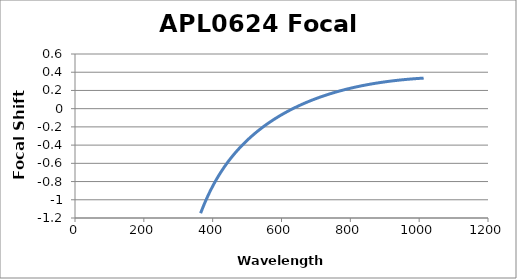
| Category | Focal Shift (mm) |
|---|---|
| 365.0 | -1.148 |
| 366.0 | -1.138 |
| 367.0 | -1.128 |
| 368.0 | -1.118 |
| 369.0 | -1.109 |
| 370.0 | -1.099 |
| 371.0 | -1.09 |
| 372.0 | -1.08 |
| 373.0 | -1.071 |
| 374.0 | -1.062 |
| 375.0 | -1.053 |
| 376.0 | -1.044 |
| 377.0 | -1.035 |
| 378.0 | -1.026 |
| 379.0 | -1.017 |
| 380.0 | -1.009 |
| 381.0 | -1 |
| 382.0 | -0.992 |
| 383.0 | -0.983 |
| 384.0 | -0.975 |
| 385.0 | -0.967 |
| 386.0 | -0.958 |
| 387.0 | -0.95 |
| 388.0 | -0.942 |
| 389.0 | -0.934 |
| 390.0 | -0.926 |
| 391.0 | -0.919 |
| 392.0 | -0.911 |
| 393.0 | -0.903 |
| 394.0 | -0.896 |
| 395.0 | -0.888 |
| 396.0 | -0.881 |
| 397.0 | -0.873 |
| 398.0 | -0.866 |
| 399.0 | -0.859 |
| 400.0 | -0.852 |
| 401.0 | -0.844 |
| 402.0 | -0.837 |
| 403.0 | -0.83 |
| 404.0 | -0.823 |
| 405.0 | -0.816 |
| 406.0 | -0.81 |
| 407.0 | -0.803 |
| 408.0 | -0.796 |
| 409.0 | -0.79 |
| 410.0 | -0.783 |
| 411.0 | -0.776 |
| 412.0 | -0.77 |
| 413.0 | -0.763 |
| 414.0 | -0.757 |
| 415.0 | -0.751 |
| 416.0 | -0.744 |
| 417.0 | -0.738 |
| 418.0 | -0.732 |
| 419.0 | -0.726 |
| 420.0 | -0.72 |
| 421.0 | -0.714 |
| 422.0 | -0.708 |
| 423.0 | -0.702 |
| 424.0 | -0.696 |
| 425.0 | -0.69 |
| 426.0 | -0.684 |
| 427.0 | -0.678 |
| 428.0 | -0.673 |
| 429.0 | -0.667 |
| 430.0 | -0.661 |
| 431.0 | -0.656 |
| 432.0 | -0.65 |
| 433.0 | -0.645 |
| 434.0 | -0.639 |
| 435.0 | -0.634 |
| 436.0 | -0.628 |
| 437.0 | -0.623 |
| 438.0 | -0.618 |
| 439.0 | -0.613 |
| 440.0 | -0.607 |
| 441.0 | -0.602 |
| 442.0 | -0.597 |
| 443.0 | -0.592 |
| 444.0 | -0.587 |
| 445.0 | -0.582 |
| 446.0 | -0.577 |
| 447.0 | -0.572 |
| 448.0 | -0.567 |
| 449.0 | -0.562 |
| 450.0 | -0.557 |
| 451.0 | -0.552 |
| 452.0 | -0.547 |
| 453.0 | -0.542 |
| 454.0 | -0.538 |
| 455.0 | -0.533 |
| 456.0 | -0.528 |
| 457.0 | -0.524 |
| 458.0 | -0.519 |
| 459.0 | -0.514 |
| 460.0 | -0.51 |
| 461.0 | -0.505 |
| 462.0 | -0.501 |
| 463.0 | -0.496 |
| 464.0 | -0.492 |
| 465.0 | -0.487 |
| 466.0 | -0.483 |
| 467.0 | -0.479 |
| 468.0 | -0.474 |
| 469.0 | -0.47 |
| 470.0 | -0.466 |
| 471.0 | -0.461 |
| 472.0 | -0.457 |
| 473.0 | -0.453 |
| 474.0 | -0.449 |
| 475.0 | -0.445 |
| 476.0 | -0.441 |
| 477.0 | -0.436 |
| 478.0 | -0.432 |
| 479.0 | -0.428 |
| 480.0 | -0.424 |
| 481.0 | -0.42 |
| 482.0 | -0.416 |
| 483.0 | -0.412 |
| 484.0 | -0.408 |
| 485.0 | -0.405 |
| 486.0 | -0.401 |
| 487.0 | -0.397 |
| 488.0 | -0.393 |
| 489.0 | -0.389 |
| 490.0 | -0.385 |
| 491.0 | -0.381 |
| 492.0 | -0.378 |
| 493.0 | -0.374 |
| 494.0 | -0.37 |
| 495.0 | -0.367 |
| 496.0 | -0.363 |
| 497.0 | -0.359 |
| 498.0 | -0.356 |
| 499.0 | -0.352 |
| 500.0 | -0.348 |
| 501.0 | -0.345 |
| 502.0 | -0.341 |
| 503.0 | -0.338 |
| 504.0 | -0.334 |
| 505.0 | -0.331 |
| 506.0 | -0.327 |
| 507.0 | -0.324 |
| 508.0 | -0.32 |
| 509.0 | -0.317 |
| 510.0 | -0.314 |
| 511.0 | -0.31 |
| 512.0 | -0.307 |
| 513.0 | -0.303 |
| 514.0 | -0.3 |
| 515.0 | -0.297 |
| 516.0 | -0.294 |
| 517.0 | -0.29 |
| 518.0 | -0.287 |
| 519.0 | -0.284 |
| 520.0 | -0.28 |
| 521.0 | -0.277 |
| 522.0 | -0.274 |
| 523.0 | -0.271 |
| 524.0 | -0.268 |
| 525.0 | -0.265 |
| 526.0 | -0.261 |
| 527.0 | -0.258 |
| 528.0 | -0.255 |
| 529.0 | -0.252 |
| 530.0 | -0.249 |
| 531.0 | -0.246 |
| 532.0 | -0.243 |
| 533.0 | -0.24 |
| 534.0 | -0.237 |
| 535.0 | -0.234 |
| 536.0 | -0.231 |
| 537.0 | -0.228 |
| 538.0 | -0.225 |
| 539.0 | -0.222 |
| 540.0 | -0.219 |
| 541.0 | -0.216 |
| 542.0 | -0.213 |
| 543.0 | -0.211 |
| 544.0 | -0.208 |
| 545.0 | -0.205 |
| 546.0 | -0.202 |
| 547.0 | -0.199 |
| 548.0 | -0.196 |
| 549.0 | -0.194 |
| 550.0 | -0.191 |
| 551.0 | -0.188 |
| 552.0 | -0.185 |
| 553.0 | -0.183 |
| 554.0 | -0.18 |
| 555.0 | -0.177 |
| 556.0 | -0.175 |
| 557.0 | -0.172 |
| 558.0 | -0.169 |
| 559.0 | -0.166 |
| 560.0 | -0.164 |
| 561.0 | -0.161 |
| 562.0 | -0.159 |
| 563.0 | -0.156 |
| 564.0 | -0.153 |
| 565.0 | -0.151 |
| 566.0 | -0.148 |
| 567.0 | -0.146 |
| 568.0 | -0.143 |
| 569.0 | -0.141 |
| 570.0 | -0.138 |
| 571.0 | -0.136 |
| 572.0 | -0.133 |
| 573.0 | -0.131 |
| 574.0 | -0.128 |
| 575.0 | -0.126 |
| 576.0 | -0.123 |
| 577.0 | -0.121 |
| 578.0 | -0.118 |
| 579.0 | -0.116 |
| 580.0 | -0.113 |
| 581.0 | -0.111 |
| 582.0 | -0.109 |
| 583.0 | -0.106 |
| 584.0 | -0.104 |
| 585.0 | -0.102 |
| 586.0 | -0.099 |
| 587.0 | -0.097 |
| 588.0 | -0.095 |
| 589.0 | -0.092 |
| 590.0 | -0.09 |
| 591.0 | -0.088 |
| 592.0 | -0.085 |
| 593.0 | -0.083 |
| 594.0 | -0.081 |
| 595.0 | -0.079 |
| 596.0 | -0.076 |
| 597.0 | -0.074 |
| 598.0 | -0.072 |
| 599.0 | -0.07 |
| 600.0 | -0.067 |
| 601.0 | -0.065 |
| 602.0 | -0.063 |
| 603.0 | -0.061 |
| 604.0 | -0.059 |
| 605.0 | -0.057 |
| 606.0 | -0.054 |
| 607.0 | -0.052 |
| 608.0 | -0.05 |
| 609.0 | -0.048 |
| 610.0 | -0.046 |
| 611.0 | -0.044 |
| 612.0 | -0.042 |
| 613.0 | -0.04 |
| 614.0 | -0.038 |
| 615.0 | -0.036 |
| 616.0 | -0.034 |
| 617.0 | -0.031 |
| 618.0 | -0.029 |
| 619.0 | -0.027 |
| 620.0 | -0.025 |
| 621.0 | -0.023 |
| 622.0 | -0.021 |
| 623.0 | -0.019 |
| 624.0 | -0.017 |
| 625.0 | -0.015 |
| 626.0 | -0.014 |
| 627.0 | -0.012 |
| 628.0 | -0.01 |
| 629.0 | -0.008 |
| 630.0 | -0.006 |
| 631.0 | -0.004 |
| 632.0 | -0.002 |
| 633.0 | 0 |
| 634.0 | 0.002 |
| 635.0 | 0.004 |
| 636.0 | 0.006 |
| 637.0 | 0.007 |
| 638.0 | 0.009 |
| 639.0 | 0.011 |
| 640.0 | 0.013 |
| 641.0 | 0.015 |
| 642.0 | 0.017 |
| 643.0 | 0.019 |
| 644.0 | 0.02 |
| 645.0 | 0.022 |
| 646.0 | 0.024 |
| 647.0 | 0.026 |
| 648.0 | 0.027 |
| 649.0 | 0.029 |
| 650.0 | 0.031 |
| 651.0 | 0.033 |
| 652.0 | 0.035 |
| 653.0 | 0.036 |
| 654.0 | 0.038 |
| 655.0 | 0.04 |
| 656.0 | 0.041 |
| 657.0 | 0.043 |
| 658.0 | 0.045 |
| 659.0 | 0.047 |
| 660.0 | 0.048 |
| 661.0 | 0.05 |
| 662.0 | 0.052 |
| 663.0 | 0.053 |
| 664.0 | 0.055 |
| 665.0 | 0.057 |
| 666.0 | 0.058 |
| 667.0 | 0.06 |
| 668.0 | 0.061 |
| 669.0 | 0.063 |
| 670.0 | 0.065 |
| 671.0 | 0.066 |
| 672.0 | 0.068 |
| 673.0 | 0.07 |
| 674.0 | 0.071 |
| 675.0 | 0.073 |
| 676.0 | 0.074 |
| 677.0 | 0.076 |
| 678.0 | 0.077 |
| 679.0 | 0.079 |
| 680.0 | 0.081 |
| 681.0 | 0.082 |
| 682.0 | 0.084 |
| 683.0 | 0.085 |
| 684.0 | 0.087 |
| 685.0 | 0.088 |
| 686.0 | 0.09 |
| 687.0 | 0.091 |
| 688.0 | 0.093 |
| 689.0 | 0.094 |
| 690.0 | 0.096 |
| 691.0 | 0.097 |
| 692.0 | 0.099 |
| 693.0 | 0.1 |
| 694.0 | 0.101 |
| 695.0 | 0.103 |
| 696.0 | 0.104 |
| 697.0 | 0.106 |
| 698.0 | 0.107 |
| 699.0 | 0.109 |
| 700.0 | 0.11 |
| 701.0 | 0.111 |
| 702.0 | 0.113 |
| 703.0 | 0.114 |
| 704.0 | 0.116 |
| 705.0 | 0.117 |
| 706.0 | 0.118 |
| 707.0 | 0.12 |
| 708.0 | 0.121 |
| 709.0 | 0.123 |
| 710.0 | 0.124 |
| 711.0 | 0.125 |
| 712.0 | 0.127 |
| 713.0 | 0.128 |
| 714.0 | 0.129 |
| 715.0 | 0.131 |
| 716.0 | 0.132 |
| 717.0 | 0.133 |
| 718.0 | 0.135 |
| 719.0 | 0.136 |
| 720.0 | 0.137 |
| 721.0 | 0.138 |
| 722.0 | 0.14 |
| 723.0 | 0.141 |
| 724.0 | 0.142 |
| 725.0 | 0.144 |
| 726.0 | 0.145 |
| 727.0 | 0.146 |
| 728.0 | 0.147 |
| 729.0 | 0.149 |
| 730.0 | 0.15 |
| 731.0 | 0.151 |
| 732.0 | 0.152 |
| 733.0 | 0.153 |
| 734.0 | 0.155 |
| 735.0 | 0.156 |
| 736.0 | 0.157 |
| 737.0 | 0.158 |
| 738.0 | 0.16 |
| 739.0 | 0.161 |
| 740.0 | 0.162 |
| 741.0 | 0.163 |
| 742.0 | 0.164 |
| 743.0 | 0.165 |
| 744.0 | 0.167 |
| 745.0 | 0.168 |
| 746.0 | 0.169 |
| 747.0 | 0.17 |
| 748.0 | 0.171 |
| 749.0 | 0.172 |
| 750.0 | 0.173 |
| 751.0 | 0.175 |
| 752.0 | 0.176 |
| 753.0 | 0.177 |
| 754.0 | 0.178 |
| 755.0 | 0.179 |
| 756.0 | 0.18 |
| 757.0 | 0.181 |
| 758.0 | 0.182 |
| 759.0 | 0.183 |
| 760.0 | 0.185 |
| 761.0 | 0.186 |
| 762.0 | 0.187 |
| 763.0 | 0.188 |
| 764.0 | 0.189 |
| 765.0 | 0.19 |
| 766.0 | 0.191 |
| 767.0 | 0.192 |
| 768.0 | 0.193 |
| 769.0 | 0.194 |
| 770.0 | 0.195 |
| 771.0 | 0.196 |
| 772.0 | 0.197 |
| 773.0 | 0.198 |
| 774.0 | 0.199 |
| 775.0 | 0.2 |
| 776.0 | 0.201 |
| 777.0 | 0.202 |
| 778.0 | 0.203 |
| 779.0 | 0.204 |
| 780.0 | 0.205 |
| 781.0 | 0.206 |
| 782.0 | 0.207 |
| 783.0 | 0.208 |
| 784.0 | 0.209 |
| 785.0 | 0.21 |
| 786.0 | 0.211 |
| 787.0 | 0.212 |
| 788.0 | 0.213 |
| 789.0 | 0.214 |
| 790.0 | 0.215 |
| 791.0 | 0.216 |
| 792.0 | 0.217 |
| 793.0 | 0.218 |
| 794.0 | 0.218 |
| 795.0 | 0.219 |
| 796.0 | 0.22 |
| 797.0 | 0.221 |
| 798.0 | 0.222 |
| 799.0 | 0.223 |
| 800.0 | 0.224 |
| 801.0 | 0.225 |
| 802.0 | 0.226 |
| 803.0 | 0.227 |
| 804.0 | 0.227 |
| 805.0 | 0.228 |
| 806.0 | 0.229 |
| 807.0 | 0.23 |
| 808.0 | 0.231 |
| 809.0 | 0.232 |
| 810.0 | 0.233 |
| 811.0 | 0.233 |
| 812.0 | 0.234 |
| 813.0 | 0.235 |
| 814.0 | 0.236 |
| 815.0 | 0.237 |
| 816.0 | 0.238 |
| 817.0 | 0.239 |
| 818.0 | 0.239 |
| 819.0 | 0.24 |
| 820.0 | 0.241 |
| 821.0 | 0.242 |
| 822.0 | 0.243 |
| 823.0 | 0.243 |
| 824.0 | 0.244 |
| 825.0 | 0.245 |
| 826.0 | 0.246 |
| 827.0 | 0.247 |
| 828.0 | 0.247 |
| 829.0 | 0.248 |
| 830.0 | 0.249 |
| 831.0 | 0.25 |
| 832.0 | 0.25 |
| 833.0 | 0.251 |
| 834.0 | 0.252 |
| 835.0 | 0.253 |
| 836.0 | 0.253 |
| 837.0 | 0.254 |
| 838.0 | 0.255 |
| 839.0 | 0.256 |
| 840.0 | 0.256 |
| 841.0 | 0.257 |
| 842.0 | 0.258 |
| 843.0 | 0.259 |
| 844.0 | 0.259 |
| 845.0 | 0.26 |
| 846.0 | 0.261 |
| 847.0 | 0.261 |
| 848.0 | 0.262 |
| 849.0 | 0.263 |
| 850.0 | 0.264 |
| 851.0 | 0.264 |
| 852.0 | 0.265 |
| 853.0 | 0.266 |
| 854.0 | 0.266 |
| 855.0 | 0.267 |
| 856.0 | 0.268 |
| 857.0 | 0.268 |
| 858.0 | 0.269 |
| 859.0 | 0.27 |
| 860.0 | 0.27 |
| 861.0 | 0.271 |
| 862.0 | 0.272 |
| 863.0 | 0.272 |
| 864.0 | 0.273 |
| 865.0 | 0.274 |
| 866.0 | 0.274 |
| 867.0 | 0.275 |
| 868.0 | 0.275 |
| 869.0 | 0.276 |
| 870.0 | 0.277 |
| 871.0 | 0.277 |
| 872.0 | 0.278 |
| 873.0 | 0.279 |
| 874.0 | 0.279 |
| 875.0 | 0.28 |
| 876.0 | 0.28 |
| 877.0 | 0.281 |
| 878.0 | 0.282 |
| 879.0 | 0.282 |
| 880.0 | 0.283 |
| 881.0 | 0.283 |
| 882.0 | 0.284 |
| 883.0 | 0.285 |
| 884.0 | 0.285 |
| 885.0 | 0.286 |
| 886.0 | 0.286 |
| 887.0 | 0.287 |
| 888.0 | 0.287 |
| 889.0 | 0.288 |
| 890.0 | 0.289 |
| 891.0 | 0.289 |
| 892.0 | 0.29 |
| 893.0 | 0.29 |
| 894.0 | 0.291 |
| 895.0 | 0.291 |
| 896.0 | 0.292 |
| 897.0 | 0.292 |
| 898.0 | 0.293 |
| 899.0 | 0.293 |
| 900.0 | 0.294 |
| 901.0 | 0.294 |
| 902.0 | 0.295 |
| 903.0 | 0.296 |
| 904.0 | 0.296 |
| 905.0 | 0.297 |
| 906.0 | 0.297 |
| 907.0 | 0.298 |
| 908.0 | 0.298 |
| 909.0 | 0.299 |
| 910.0 | 0.299 |
| 911.0 | 0.3 |
| 912.0 | 0.3 |
| 913.0 | 0.301 |
| 914.0 | 0.301 |
| 915.0 | 0.301 |
| 916.0 | 0.302 |
| 917.0 | 0.302 |
| 918.0 | 0.303 |
| 919.0 | 0.303 |
| 920.0 | 0.304 |
| 921.0 | 0.304 |
| 922.0 | 0.305 |
| 923.0 | 0.305 |
| 924.0 | 0.306 |
| 925.0 | 0.306 |
| 926.0 | 0.307 |
| 927.0 | 0.307 |
| 928.0 | 0.307 |
| 929.0 | 0.308 |
| 930.0 | 0.308 |
| 931.0 | 0.309 |
| 932.0 | 0.309 |
| 933.0 | 0.31 |
| 934.0 | 0.31 |
| 935.0 | 0.31 |
| 936.0 | 0.311 |
| 937.0 | 0.311 |
| 938.0 | 0.312 |
| 939.0 | 0.312 |
| 940.0 | 0.313 |
| 941.0 | 0.313 |
| 942.0 | 0.313 |
| 943.0 | 0.314 |
| 944.0 | 0.314 |
| 945.0 | 0.315 |
| 946.0 | 0.315 |
| 947.0 | 0.315 |
| 948.0 | 0.316 |
| 949.0 | 0.316 |
| 950.0 | 0.316 |
| 951.0 | 0.317 |
| 952.0 | 0.317 |
| 953.0 | 0.318 |
| 954.0 | 0.318 |
| 955.0 | 0.318 |
| 956.0 | 0.319 |
| 957.0 | 0.319 |
| 958.0 | 0.319 |
| 959.0 | 0.32 |
| 960.0 | 0.32 |
| 961.0 | 0.32 |
| 962.0 | 0.321 |
| 963.0 | 0.321 |
| 964.0 | 0.322 |
| 965.0 | 0.322 |
| 966.0 | 0.322 |
| 967.0 | 0.323 |
| 968.0 | 0.323 |
| 969.0 | 0.323 |
| 970.0 | 0.324 |
| 971.0 | 0.324 |
| 972.0 | 0.324 |
| 973.0 | 0.324 |
| 974.0 | 0.325 |
| 975.0 | 0.325 |
| 976.0 | 0.325 |
| 977.0 | 0.326 |
| 978.0 | 0.326 |
| 979.0 | 0.326 |
| 980.0 | 0.327 |
| 981.0 | 0.327 |
| 982.0 | 0.327 |
| 983.0 | 0.328 |
| 984.0 | 0.328 |
| 985.0 | 0.328 |
| 986.0 | 0.328 |
| 987.0 | 0.329 |
| 988.0 | 0.329 |
| 989.0 | 0.329 |
| 990.0 | 0.33 |
| 991.0 | 0.33 |
| 992.0 | 0.33 |
| 993.0 | 0.33 |
| 994.0 | 0.331 |
| 995.0 | 0.331 |
| 996.0 | 0.331 |
| 997.0 | 0.331 |
| 998.0 | 0.332 |
| 999.0 | 0.332 |
| 1000.0 | 0.332 |
| 1001.0 | 0.332 |
| 1002.0 | 0.333 |
| 1003.0 | 0.333 |
| 1004.0 | 0.333 |
| 1005.0 | 0.333 |
| 1006.0 | 0.334 |
| 1007.0 | 0.334 |
| 1008.0 | 0.334 |
| 1009.0 | 0.334 |
| 1010.0 | 0.335 |
| 1011.0 | 0.335 |
| 1012.0 | 0.335 |
| 1013.0 | 0.335 |